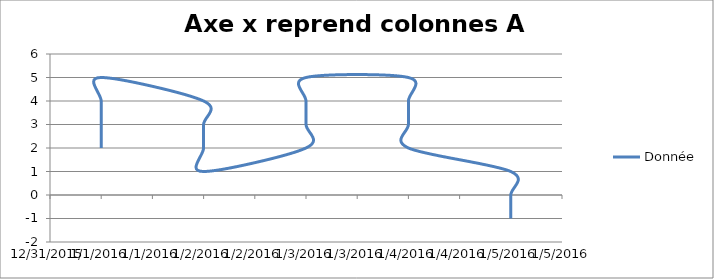
| Category | Donnée |
|---|---|
| 0 | 2 |
| 1 | 3 |
| 2 | 4 |
| 3 | 5 |
| 4 | 4 |
| 5 | 3 |
| 6 | 2 |
| 7 | 1 |
| 8 | 2 |
| 9 | 3 |
| 10 | 4 |
| 11 | 5 |
| 12 | 5 |
| 13 | 4 |
| 14 | 3 |
| 15 | 2 |
| 16 | 1 |
| 17 | 0 |
| 18 | -1 |
| 19 | 0 |